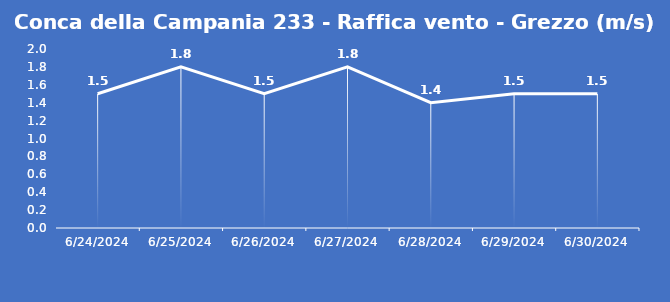
| Category | Conca della Campania 233 - Raffica vento - Grezzo (m/s) |
|---|---|
| 6/24/24 | 1.5 |
| 6/25/24 | 1.8 |
| 6/26/24 | 1.5 |
| 6/27/24 | 1.8 |
| 6/28/24 | 1.4 |
| 6/29/24 | 1.5 |
| 6/30/24 | 1.5 |